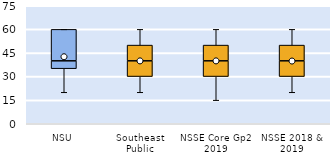
| Category | 25th | 50th | 75th |
|---|---|---|---|
| NSU | 35 | 5 | 20 |
| Southeast Public | 30 | 10 | 10 |
| NSSE Core Gp2 2019 | 30 | 10 | 10 |
| NSSE 2018 & 2019 | 30 | 10 | 10 |